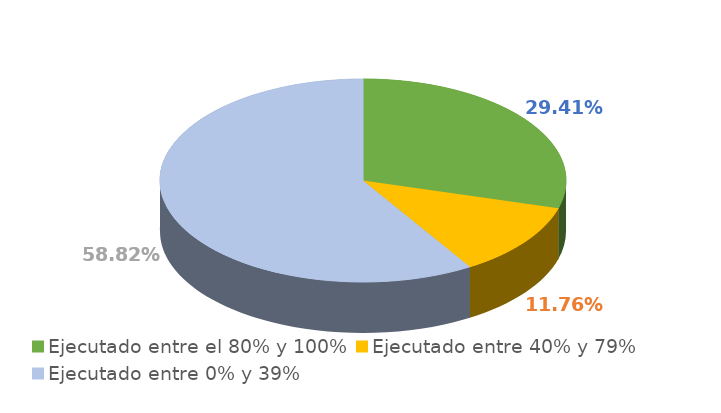
| Category | Series 0 |
|---|---|
| Ejecutado entre el 80% y 100% | 0.294 |
| Ejecutado entre 40% y 79% | 0.118 |
| Ejecutado entre 0% y 39% | 0.588 |